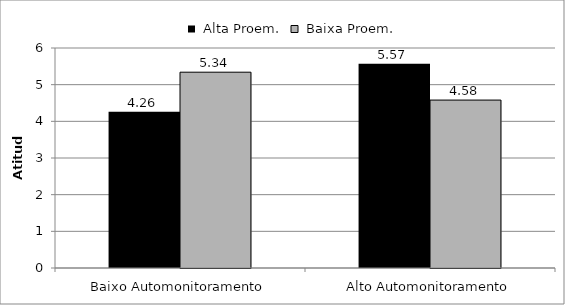
| Category | Series 0 | Series 1 |
|---|---|---|
| Baixo Automonitoramento | 4.26 | 5.34 |
| Alto Automonitoramento | 5.57 | 4.58 |